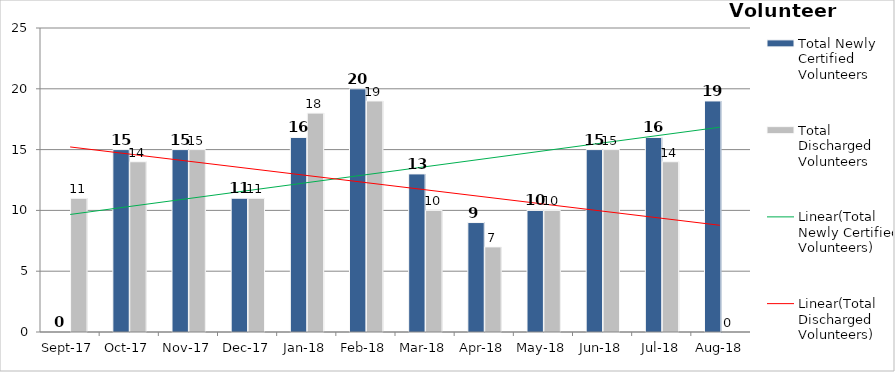
| Category | Total Newly Certified Volunteers | Total Discharged Volunteers |
|---|---|---|
| 2017-09-01 | 0 | 11 |
| 2017-10-01 | 15 | 14 |
| 2017-11-01 | 15 | 15 |
| 2017-12-01 | 11 | 11 |
| 2018-01-01 | 16 | 18 |
| 2018-02-01 | 20 | 19 |
| 2018-03-01 | 13 | 10 |
| 2018-04-01 | 9 | 7 |
| 2018-05-01 | 10 | 10 |
| 2018-06-01 | 15 | 15 |
| 2018-07-01 | 16 | 14 |
| 2018-08-01 | 19 | 0 |